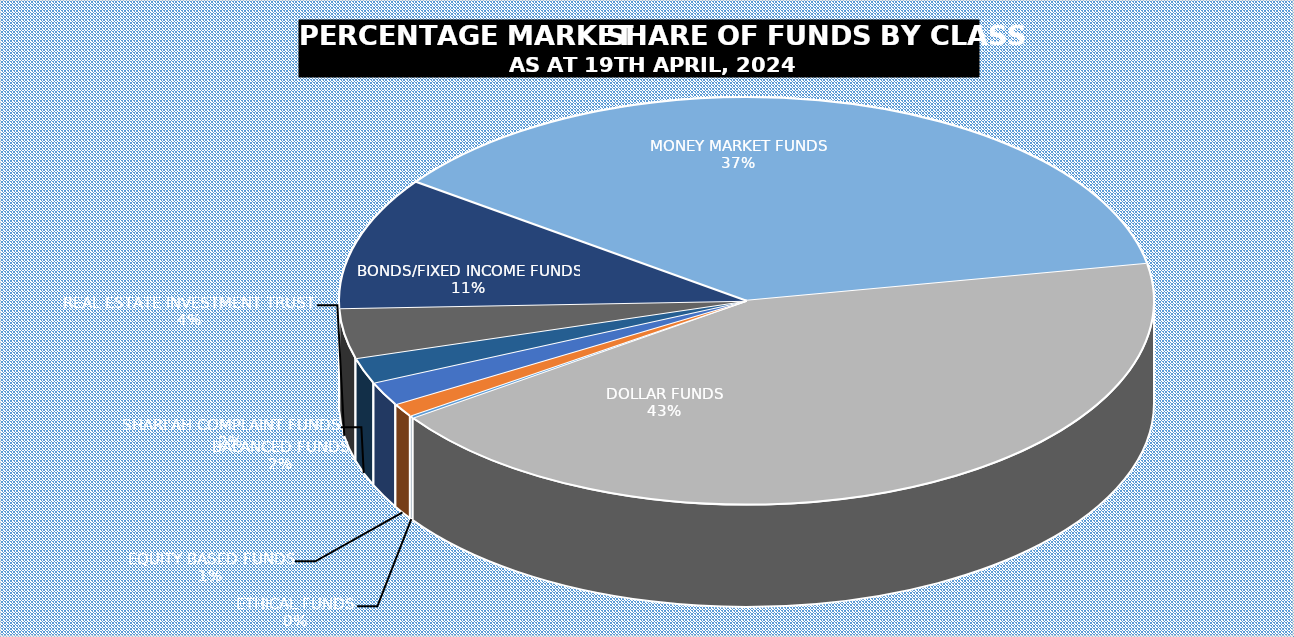
| Category | 19-Apr |
|---|---|
| ETHICAL FUNDS | 4752808696.87 |
| EQUITY BASED FUNDS | 26572100101.452 |
| BALANCED FUNDS | 47213858445.277 |
| SHARI'AH COMPLAINT FUNDS | 51231840232.038 |
| REAL ESTATE INVESTMENT TRUST | 99918187898.837 |
| BONDS/FIXED INCOME FUNDS | 263752465697.429 |
| MONEY MARKET FUNDS | 933193021103.145 |
| DOLLAR FUNDS | 1084163633164.555 |